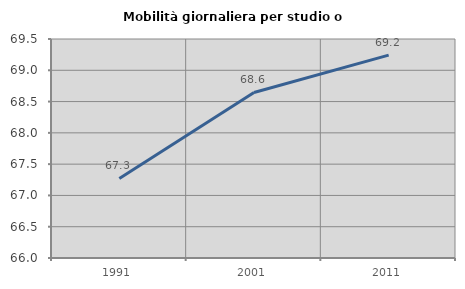
| Category | Mobilità giornaliera per studio o lavoro |
|---|---|
| 1991.0 | 67.271 |
| 2001.0 | 68.645 |
| 2011.0 | 69.242 |